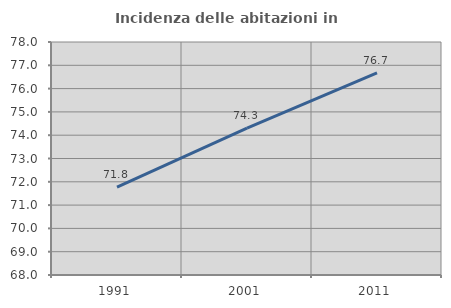
| Category | Incidenza delle abitazioni in proprietà  |
|---|---|
| 1991.0 | 71.776 |
| 2001.0 | 74.307 |
| 2011.0 | 76.674 |